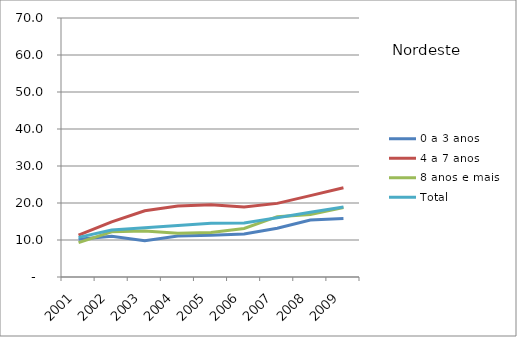
| Category | 0 a 3 anos | 4 a 7 anos | 8 anos e mais | Total |
|---|---|---|---|---|
| 2001.0 | 10.2 | 11.3 | 9.3 | 10.7 |
| 2002.0 | 11 | 14.9 | 12.2 | 12.7 |
| 2003.0 | 9.8 | 17.9 | 12.4 | 13.3 |
| 2004.0 | 11.1 | 19.2 | 11.8 | 13.9 |
| 2005.0 | 11.3 | 19.5 | 12 | 14.5 |
| 2006.0 | 11.6 | 18.9 | 13.1 | 14.6 |
| 2007.0 | 13.2 | 19.9 | 16.3 | 16 |
| 2008.0 | 15.4 | 22 | 16.9 | 17.5 |
| 2009.0 | 15.8 | 24.1 | 18.8 | 18.9 |